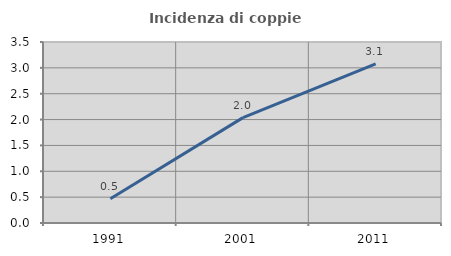
| Category | Incidenza di coppie miste |
|---|---|
| 1991.0 | 0.467 |
| 2001.0 | 2.038 |
| 2011.0 | 3.077 |